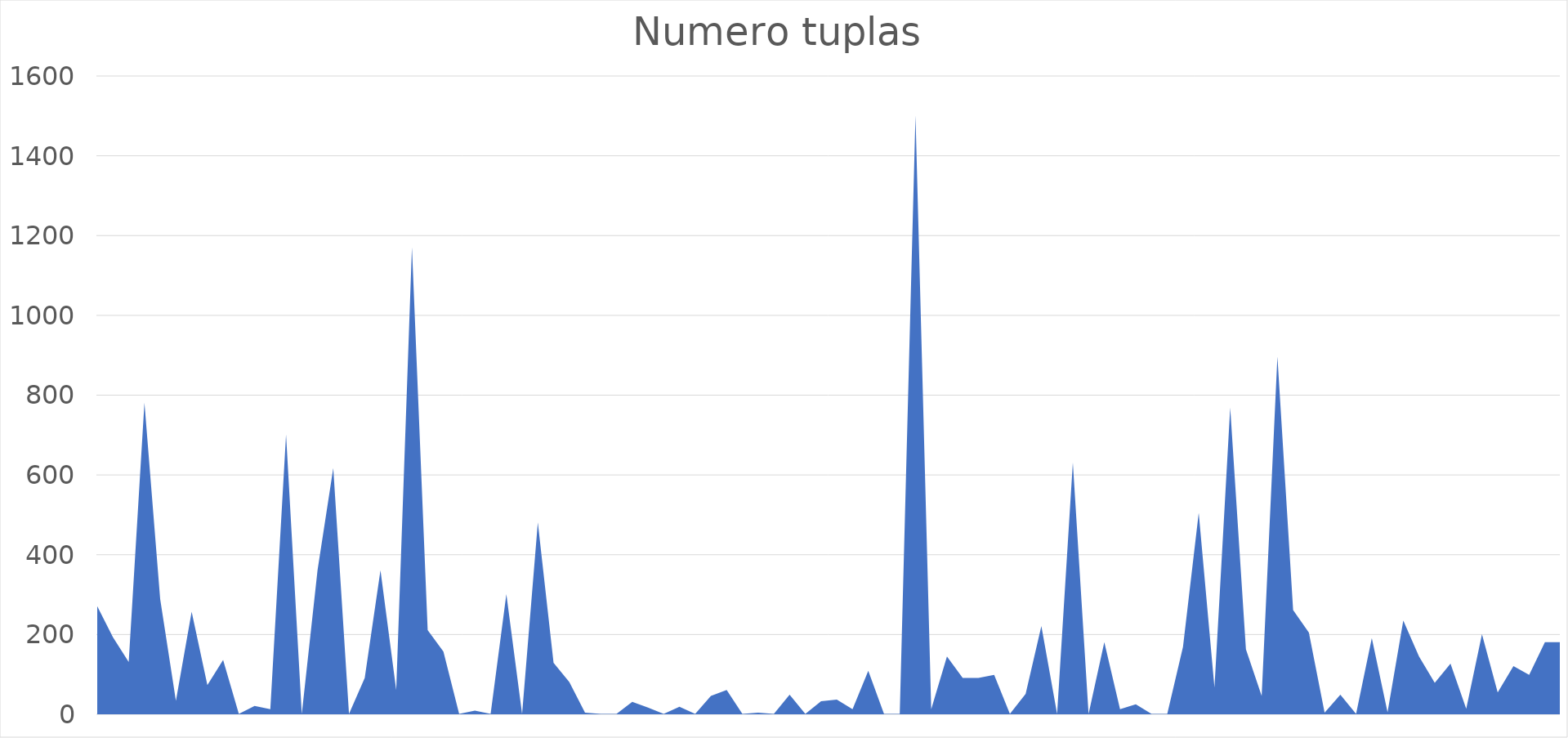
| Category | Series 0 |
|---|---|
| 0 | 271 |
| 1 | 193 |
| 2 | 131 |
| 3 | 781 |
| 4 | 289 |
| 5 | 34 |
| 6 | 257 |
| 7 | 73 |
| 8 | 136 |
| 9 | 1 |
| 10 | 21 |
| 11 | 13 |
| 12 | 701 |
| 13 | 1 |
| 14 | 361 |
| 15 | 617 |
| 16 | 1 |
| 17 | 91 |
| 18 | 361 |
| 19 | 61 |
| 20 | 1171 |
| 21 | 211 |
| 22 | 157 |
| 23 | 1 |
| 24 | 9 |
| 25 | 1 |
| 26 | 301 |
| 27 | 1 |
| 28 | 481 |
| 29 | 129 |
| 30 | 81 |
| 31 | 4 |
| 32 | 1 |
| 33 | 1 |
| 34 | 31 |
| 35 | 17 |
| 36 | 1 |
| 37 | 19 |
| 38 | 1 |
| 39 | 46 |
| 40 | 61 |
| 41 | 1 |
| 42 | 4 |
| 43 | 1 |
| 44 | 49 |
| 45 | 1 |
| 46 | 33 |
| 47 | 37 |
| 48 | 13 |
| 49 | 109 |
| 50 | 1 |
| 51 | 1 |
| 52 | 1501 |
| 53 | 13 |
| 54 | 145 |
| 55 | 91 |
| 56 | 91 |
| 57 | 99 |
| 58 | 1 |
| 59 | 51 |
| 60 | 221 |
| 61 | 1 |
| 62 | 631 |
| 63 | 1 |
| 64 | 181 |
| 65 | 13 |
| 66 | 25 |
| 67 | 1 |
| 68 | 1 |
| 69 | 169 |
| 70 | 505 |
| 71 | 67 |
| 72 | 769 |
| 73 | 163 |
| 74 | 46 |
| 75 | 897 |
| 76 | 261 |
| 77 | 205 |
| 78 | 4 |
| 79 | 49 |
| 80 | 1 |
| 81 | 191 |
| 82 | 5 |
| 83 | 235 |
| 84 | 145 |
| 85 | 79 |
| 86 | 127 |
| 87 | 14 |
| 88 | 201 |
| 89 | 55 |
| 90 | 121 |
| 91 | 99 |
| 92 | 181 |
| 93 | 181 |